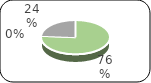
| Category | Series 0 |
|---|---|
| 0 | 72696313.71 |
| 1 | 0 |
| 2 | 22684027.02 |